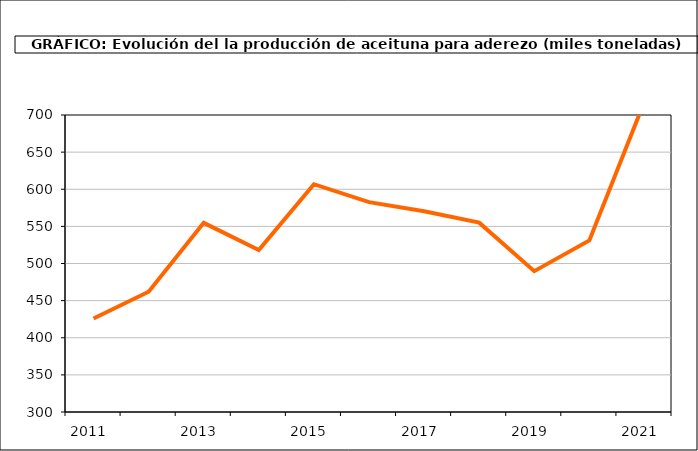
| Category | producción |
|---|---|
| 2011.0 | 425.955 |
| 2012.0 | 461.963 |
| 2013.0 | 554.749 |
| 2014.0 | 518.23 |
| 2015.0 | 606.789 |
| 2016.0 | 582.648 |
| 2017.0 | 570.295 |
| 2018.0 | 555.033 |
| 2019.0 | 489.721 |
| 2020.0 | 531.073 |
| 2021.0 | 718.192 |